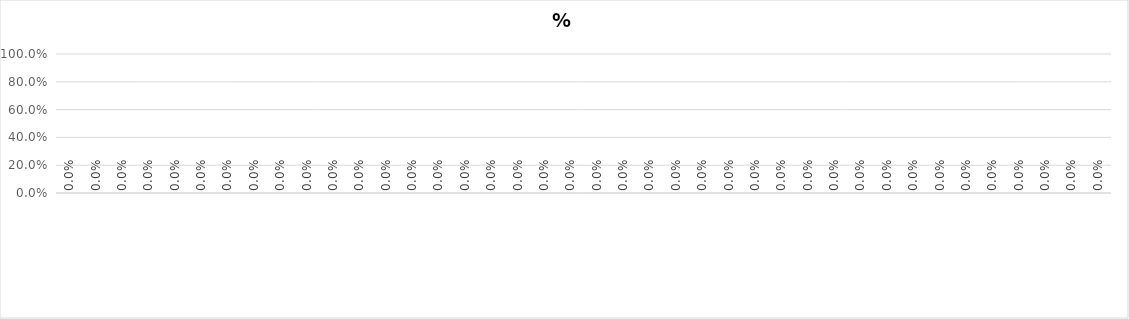
| Category | %  качества |
|---|---|
|   | 0 |
|   | 0 |
|   | 0 |
|   | 0 |
|   | 0 |
|   | 0 |
|   | 0 |
|   | 0 |
|   | 0 |
|   | 0 |
|   | 0 |
|   | 0 |
|   | 0 |
|   | 0 |
|   | 0 |
|   | 0 |
|   | 0 |
|   | 0 |
|   | 0 |
|   | 0 |
|   | 0 |
|   | 0 |
|   | 0 |
|   | 0 |
|   | 0 |
|   | 0 |
|   | 0 |
|   | 0 |
|   | 0 |
|   | 0 |
|   | 0 |
|   | 0 |
|   | 0 |
|   | 0 |
|   | 0 |
|   | 0 |
|   | 0 |
|   | 0 |
|   | 0 |
|   | 0 |